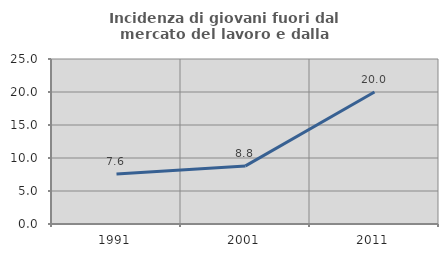
| Category | Incidenza di giovani fuori dal mercato del lavoro e dalla formazione  |
|---|---|
| 1991.0 | 7.586 |
| 2001.0 | 8.8 |
| 2011.0 | 20 |